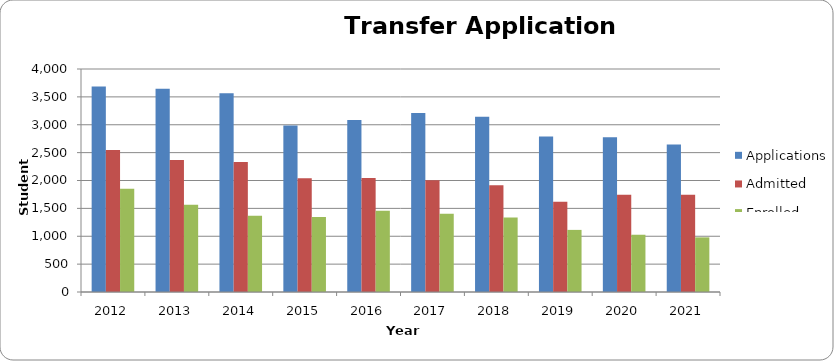
| Category | Applications | Admitted | Enrolled |
|---|---|---|---|
| 2012.0 | 3684 | 2548 | 1851 |
| 2013.0 | 3647 | 2368 | 1566 |
| 2014.0 | 3567 | 2334 | 1367 |
| 2015.0 | 2987 | 2041 | 1346 |
| 2016.0 | 3086 | 2046 | 1459 |
| 2017.0 | 3211 | 2005 | 1403 |
| 2018.0 | 3143 | 1917 | 1337 |
| 2019.0 | 2789 | 1618 | 1114 |
| 2020.0 | 2774 | 1743 | 1027 |
| 2021.0 | 2647 | 1746 | 980 |